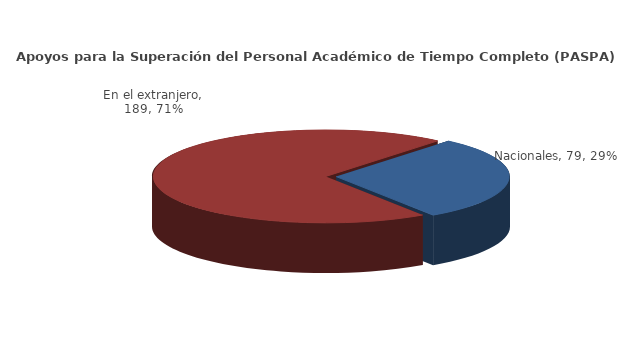
| Category | Series 0 |
|---|---|
| Nacionales | 79 |
| En el extranjero | 189 |